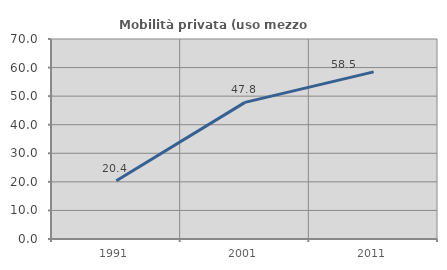
| Category | Mobilità privata (uso mezzo privato) |
|---|---|
| 1991.0 | 20.384 |
| 2001.0 | 47.825 |
| 2011.0 | 58.494 |